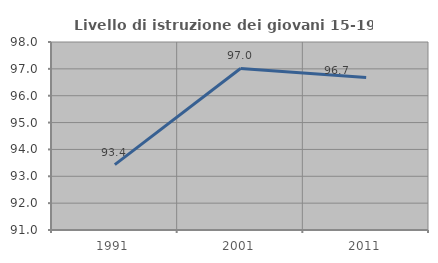
| Category | Livello di istruzione dei giovani 15-19 anni |
|---|---|
| 1991.0 | 93.436 |
| 2001.0 | 97.015 |
| 2011.0 | 96.68 |